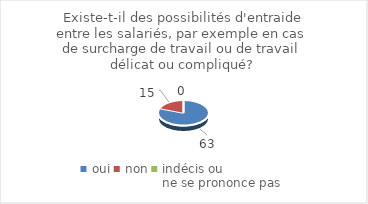
| Category | Existe-t-il des possibilités d'entraide entre les salariés, par exemple en cas de surcharge de travail ou de travail délicat ou compliqué? |
|---|---|
| oui | 63 |
| non | 15 |
| indécis ou 
ne se prononce pas | 0 |